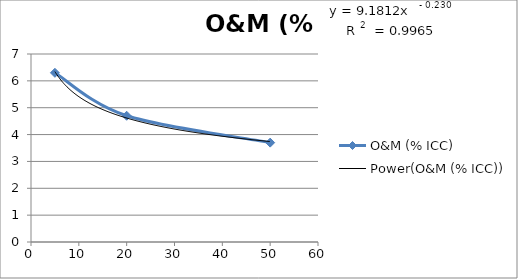
| Category | O&M (% ICC) |
|---|---|
| 5.0 | 6.3 |
| 20.0 | 4.7 |
| 50.0 | 3.7 |